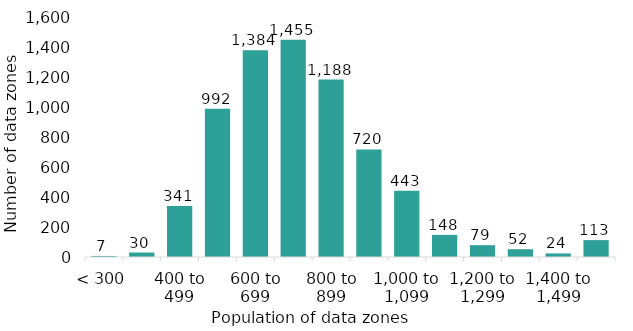
| Category | Series 0 |
|---|---|
| < 300 | 7 |
| 300 to 399 | 30 |
| 400 to 499 | 341 |
| 500 to 599 | 992 |
| 600 to 699 | 1384 |
| 700 to 799 | 1455 |
| 800 to 899 | 1188 |
| 900 to 999 | 720 |
| 1,000 to 1,099 | 443 |
| 1,100 to 1,199 | 148 |
| 1,200 to 1,299 | 79 |
| 1,300 to 1,399 | 52 |
| 1,400 to 1,499 | 24 |
| 1,500 + | 113 |